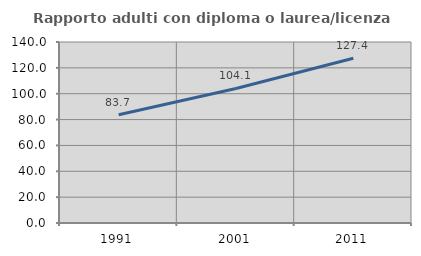
| Category | Rapporto adulti con diploma o laurea/licenza media  |
|---|---|
| 1991.0 | 83.735 |
| 2001.0 | 104.061 |
| 2011.0 | 127.411 |